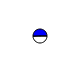
| Category | Series 0 |
|---|---|
| 0 | 1816625 |
| 1 | 1851221 |